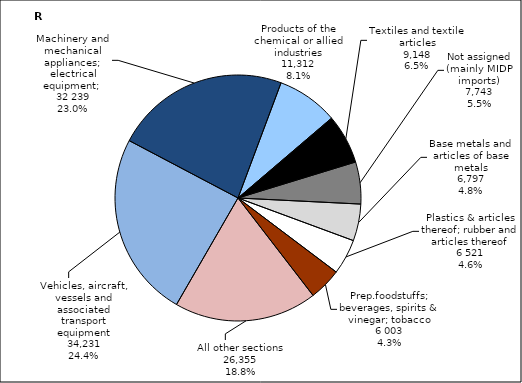
| Category | Series 0 |
|---|---|
| Vehicles, aircraft, vessels and associated transport equipment | 34230838032.77 |
| Machinery and mechanical appliances; electrical equipment; parts thereof; television image and sound recorders and reproducers, and parts and accessories of such articles | 32238622899.49 |
| Products of the chemical or allied industries | 11312443902.39 |
| Textiles and textile articles | 9147591894.44 |
| Not assigned3 | 7743484720.79 |
| Base metals and articles of base metals | 6797456936.31 |
| Plastics and articles thereof; rubber and articles thereof  | 6521266977.02 |
| Prepared foodstuffs; beverages, spirits and vinegar; tobacco and manufactured tobacco substitutes | 6003243272.37 |
| All other sections | 26354782848.27 |